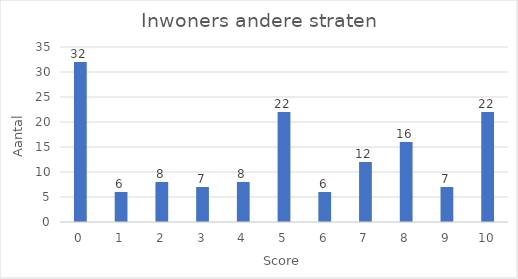
| Category | Aantal |
|---|---|
| 0.0 | 32 |
| 1.0 | 6 |
| 2.0 | 8 |
| 3.0 | 7 |
| 4.0 | 8 |
| 5.0 | 22 |
| 6.0 | 6 |
| 7.0 | 12 |
| 8.0 | 16 |
| 9.0 | 7 |
| 10.0 | 22 |